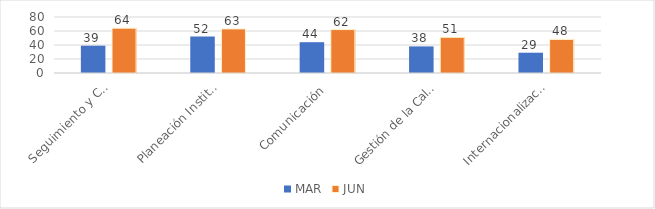
| Category | MAR | JUN |
|---|---|---|
| Seguimiento y Control | 39 | 64 |
| Planeación Institucional | 52 | 63 |
| Comunicación | 44 | 62 |
| Gestión de la Calidad | 38 | 51 |
| Internacionalización | 29 | 48 |